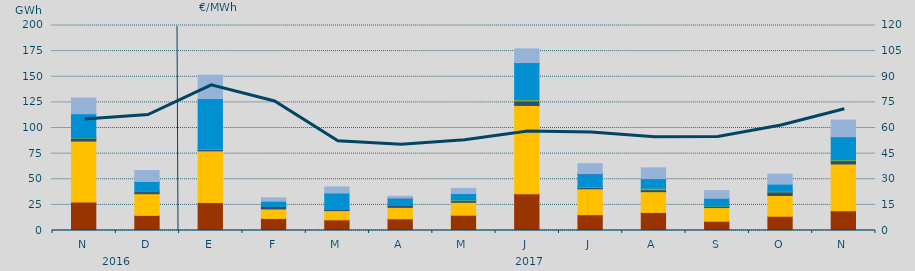
| Category | Carbón | Ciclo Combinado | Cogeneración | Consumo Bombeo | Eólica | Hidráulica | Nuclear | Turbinación bombeo |
|---|---|---|---|---|---|---|---|---|
| N | 27911.6 | 59353 | 0 | 2603.5 | 562.8 | 23494.9 | 0 | 15319.9 |
| D | 14759.8 | 21112.2 | 0 | 2054.9 | 290 | 9517.7 | 60 | 10705.2 |
| E | 27333.2 | 50390.4 | 0 | 1420.1 | 796.7 | 48799.7 | 0 | 22768.5 |
| F | 11782.3 | 9297.4 | 0 | 2429.3 | 37.7 | 5011.6 | 0 | 3301.6 |
| M | 10392.3 | 9024.8 | 0 | 1213 | 83.9 | 15815.6 | 0 | 5970.4 |
| A | 11417.3 | 11177.4 | 1 | 2298.7 | 146.3 | 6448.1 | 105 | 1824.9 |
| M | 14921.9 | 12578.5 | 0 | 1623.5 | 791 | 6148.7 | 0 | 5041.6 |
| J | 35897.1 | 86103.9 | 16 | 4321.9 | 1499 | 35181.7 | 537 | 13587.3 |
| J | 15424.3 | 25298.7 | 6 | 1196.5 | 694.8 | 12560.8 | 231 | 9853.3 |
| A | 17604.1 | 20278.5 | 0 | 1953.7 | 1479 | 9282.6 | 0 | 10537.6 |
| S | 9030.9 | 13355.9 | 0 | 972.7 | 456.9 | 7586.6 | 0 | 7497.3 |
| O | 13899.2 | 20227.3 | 0 | 3473.9 | 731.2 | 6859.3 | 0 | 9809.3 |
| N | 19298.3 | 45604 | 0 | 3226 | 983.4 | 22432 | 0 | 16186.5 |